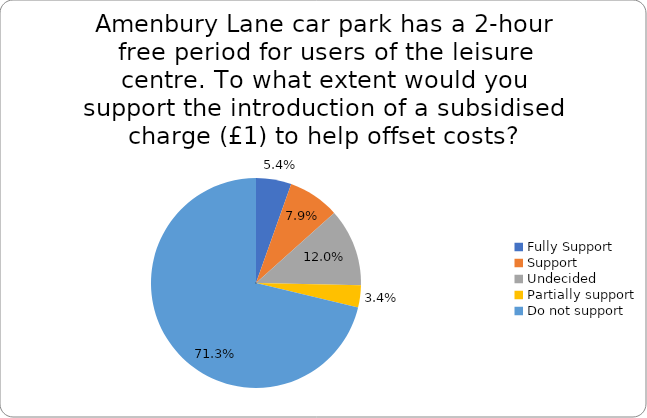
| Category | Series 0 |
|---|---|
| Fully Support | 0.054 |
| Support | 0.079 |
| Undecided | 0.12 |
| Partially support | 0.034 |
| Do not support | 0.713 |